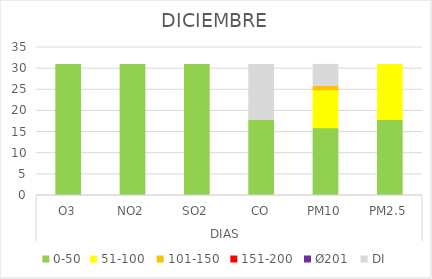
| Category | 0-50 | 51-100  | 101-150  | 151-200  | Ø201  | DI |
|---|---|---|---|---|---|---|
| 0 | 31 | 0 | 0 | 0 | 0 | 0 |
| 1 | 31 | 0 | 0 | 0 | 0 | 0 |
| 2 | 31 | 0 | 0 | 0 | 0 | 0 |
| 3 | 18 | 0 | 0 | 0 | 0 | 13 |
| 4 | 16 | 9 | 1 | 0 | 0 | 5 |
| 5 | 18 | 13 | 0 | 0 | 0 | 0 |